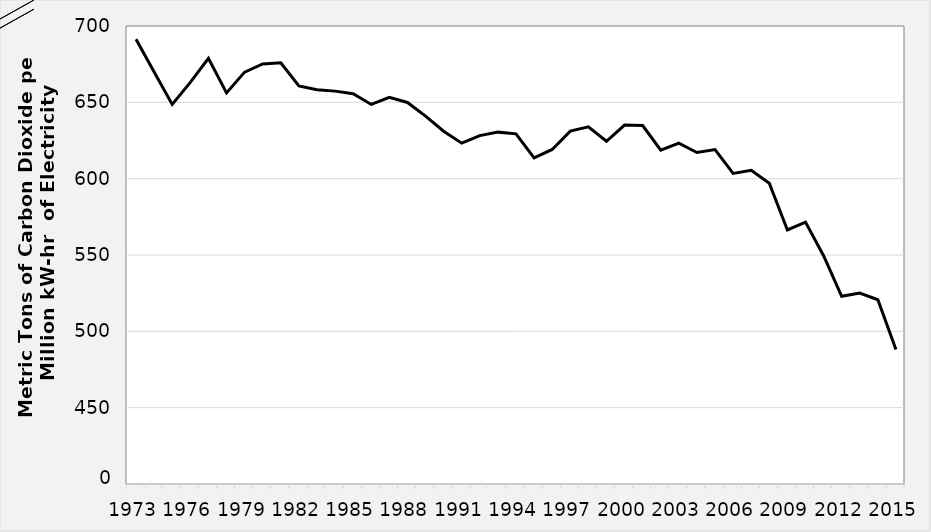
| Category | Series 0 |
|---|---|
| 1973.0 | 691.323 |
| 1974.0 | 669.818 |
| 1975.0 | 648.615 |
| 1976.0 | 663.094 |
| 1977.0 | 678.864 |
| 1978.0 | 656.138 |
| 1979.0 | 669.781 |
| 1980.0 | 675.162 |
| 1981.0 | 675.944 |
| 1982.0 | 660.713 |
| 1983.0 | 658.256 |
| 1984.0 | 657.342 |
| 1985.0 | 655.635 |
| 1986.0 | 648.616 |
| 1987.0 | 653.248 |
| 1988.0 | 649.914 |
| 1989.0 | 640.96 |
| 1990.0 | 631.109 |
| 1991.0 | 623.256 |
| 1992.0 | 628.226 |
| 1993.0 | 630.479 |
| 1994.0 | 629.347 |
| 1995.0 | 613.622 |
| 1996.0 | 619.115 |
| 1997.0 | 631.17 |
| 1998.0 | 633.939 |
| 1999.0 | 624.486 |
| 2000.0 | 635.101 |
| 2001.0 | 634.819 |
| 2002.0 | 618.656 |
| 2003.0 | 623.256 |
| 2004.0 | 617.165 |
| 2005.0 | 619.038 |
| 2006.0 | 603.457 |
| 2007.0 | 605.434 |
| 2008.0 | 597.054 |
| 2009.0 | 566.402 |
| 2010.0 | 571.527 |
| 2011.0 | 549.551 |
| 2012.0 | 522.925 |
| 2013.0 | 525.114 |
| 2014.0 | 520.676 |
| 2015.0 | 488.101 |